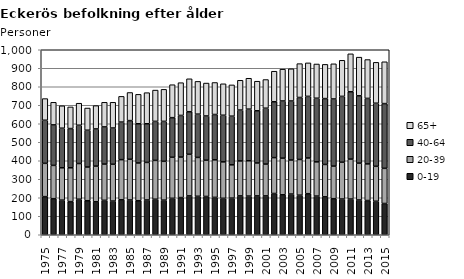
| Category | 0-19 | 20-39 | 40-64 | 65+ |
|---|---|---|---|---|
| 1975.0 | 206 | 180 | 233 | 117 |
| 1976.0 | 195 | 180 | 219 | 122 |
| 1977.0 | 187 | 175 | 214 | 121 |
| 1978.0 | 179 | 183 | 212 | 117 |
| 1979.0 | 192 | 193 | 207 | 119 |
| 1980.0 | 184 | 182 | 199 | 120 |
| 1981.0 | 178 | 193 | 201 | 126 |
| 1982.0 | 186 | 196 | 201 | 133 |
| 1983.0 | 182 | 199 | 196 | 139 |
| 1984.0 | 189 | 217 | 203 | 139 |
| 1985.0 | 188 | 220 | 209 | 152 |
| 1986.0 | 184 | 204 | 212 | 159 |
| 1987.0 | 188 | 203 | 209 | 168 |
| 1988.0 | 192 | 210 | 211 | 169 |
| 1989.0 | 187 | 210 | 216 | 173 |
| 1990.0 | 197 | 222 | 214 | 178 |
| 1991.0 | 201 | 219 | 225 | 177 |
| 1992.0 | 210 | 225 | 230 | 178 |
| 1993.0 | 208 | 210 | 234 | 177 |
| 1994.0 | 207 | 196 | 239 | 178 |
| 1995.0 | 202 | 203 | 245 | 173 |
| 1996.0 | 197 | 197 | 252 | 170 |
| 1997.0 | 198 | 180 | 263 | 169 |
| 1998.0 | 210 | 189 | 275 | 161 |
| 1999.0 | 209 | 191 | 279 | 167 |
| 2000.0 | 210 | 178 | 282 | 160 |
| 2001.0 | 210 | 172 | 302 | 155 |
| 2002.0 | 223 | 194 | 302 | 165 |
| 2003.0 | 216 | 198 | 309 | 172 |
| 2004.0 | 220 | 184 | 319 | 174 |
| 2005.0 | 214 | 193 | 335 | 183 |
| 2006.0 | 222 | 193 | 333 | 181 |
| 2007.0 | 209 | 185 | 344 | 185 |
| 2008.0 | 205 | 175 | 356 | 185 |
| 2009.0 | 195 | 176 | 363 | 190 |
| 2010.0 | 193 | 199 | 356 | 195 |
| 2011.0 | 193 | 216 | 364 | 205 |
| 2012.0 | 188 | 199 | 364 | 209 |
| 2013.0 | 185 | 198 | 354 | 210 |
| 2014.0 | 181 | 189 | 341 | 221 |
| 2015.0 | 169 | 190 | 350 | 226 |